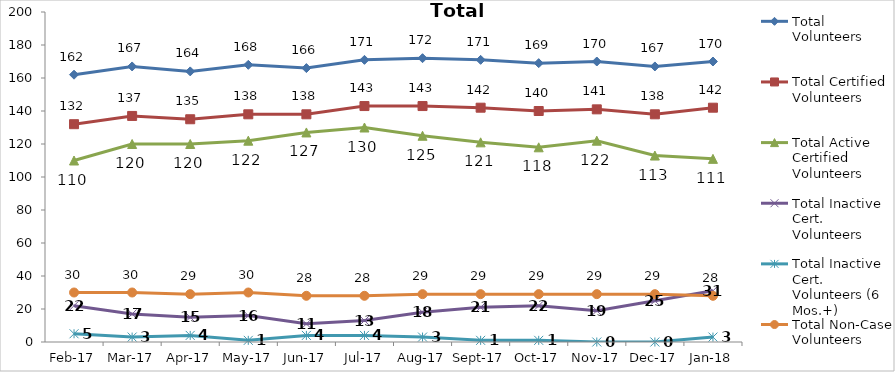
| Category | Total Volunteers | Total Certified Volunteers | Total Active Certified Volunteers | Total Inactive Cert. Volunteers | Total Inactive Cert. Volunteers (6 Mos.+) | Total Non-Case Volunteers |
|---|---|---|---|---|---|---|
| 2017-02-01 | 162 | 132 | 110 | 22 | 5 | 30 |
| 2017-03-01 | 167 | 137 | 120 | 17 | 3 | 30 |
| 2017-04-01 | 164 | 135 | 120 | 15 | 4 | 29 |
| 2017-05-01 | 168 | 138 | 122 | 16 | 1 | 30 |
| 2017-06-01 | 166 | 138 | 127 | 11 | 4 | 28 |
| 2017-07-01 | 171 | 143 | 130 | 13 | 4 | 28 |
| 2017-08-01 | 172 | 143 | 125 | 18 | 3 | 29 |
| 2017-09-01 | 171 | 142 | 121 | 21 | 1 | 29 |
| 2017-10-01 | 169 | 140 | 118 | 22 | 1 | 29 |
| 2017-11-01 | 170 | 141 | 122 | 19 | 0 | 29 |
| 2017-12-01 | 167 | 138 | 113 | 25 | 0 | 29 |
| 2018-01-01 | 170 | 142 | 111 | 31 | 3 | 28 |